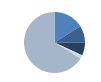
| Category | Series 0 |
|---|---|
| 0 | 181 |
| 1 | 100 |
| 2 | 77 |
| 3 | 21 |
| 4 | 743 |